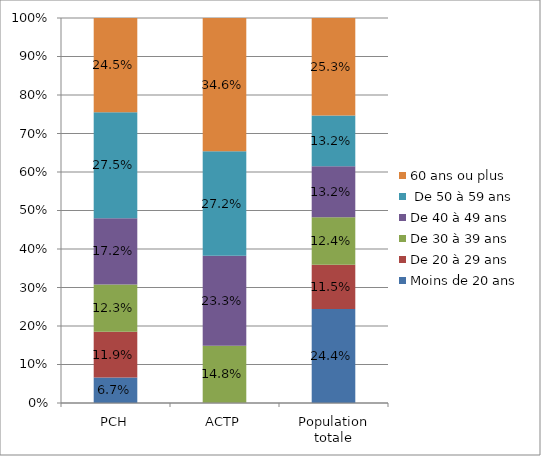
| Category | Moins de 20 ans  | De 20 à 29 ans | De 30 à 39 ans | De 40 à 49 ans |  De 50 à 59 ans | 60 ans ou plus |
|---|---|---|---|---|---|---|
| PCH | 0.067 | 0.119 | 0.123 | 0.172 | 0.275 | 0.245 |
| ACTP | 0 | 0 | 0.148 | 0.233 | 0.272 | 0.346 |
| Population totale | 0.244 | 0.115 | 0.124 | 0.132 | 0.132 | 0.253 |